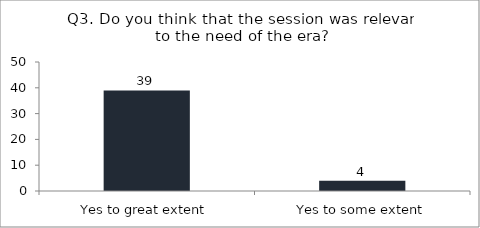
| Category | Q3. Do you think that the session was relevant to the need of the era? |
|---|---|
| Yes to great extent | 39 |
| Yes to some extent | 4 |